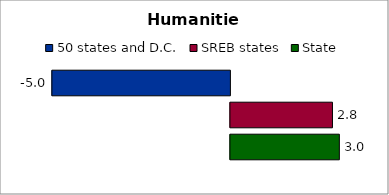
| Category | 50 states and D.C. | SREB states | State |
|---|---|---|---|
| 0 | -4.959 | 2.843 | 3.035 |